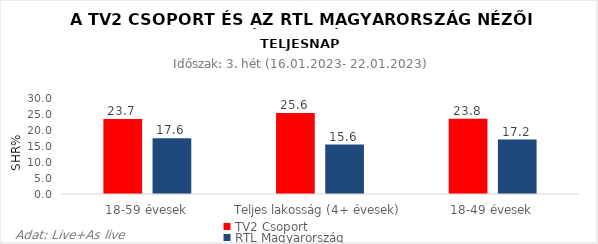
| Category | TV2 Csoport | RTL Magyarország |
|---|---|---|
| 18-59 évesek | 23.7 | 17.6 |
| Teljes lakosság (4+ évesek) | 25.6 | 15.6 |
| 18-49 évesek | 23.8 | 17.2 |